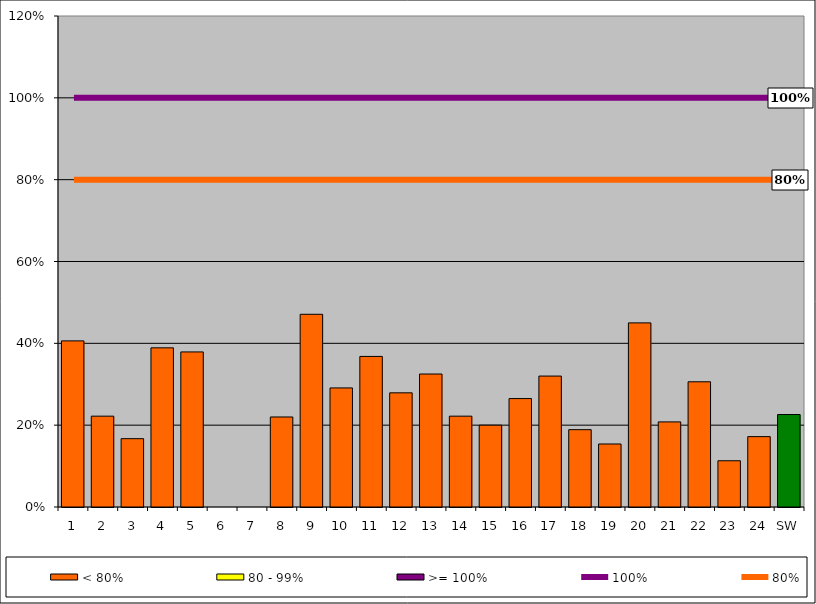
| Category | < 80% | 80 - 99% | >= 100% |
|---|---|---|---|
| 1 | 0.406 | 0 | 0 |
| 2 | 0.222 | 0 | 0 |
| 3 | 0.167 | 0 | 0 |
| 4 | 0.389 | 0 | 0 |
| 5 | 0.379 | 0 | 0 |
| 6 | 0 | 0 | 0 |
| 7 | 0 | 0 | 0 |
| 8 | 0.22 | 0 | 0 |
| 9 | 0.471 | 0 | 0 |
| 10 | 0.291 | 0 | 0 |
| 11 | 0.368 | 0 | 0 |
| 12 | 0.279 | 0 | 0 |
| 13 | 0.325 | 0 | 0 |
| 14 | 0.222 | 0 | 0 |
| 15 | 0.2 | 0 | 0 |
| 16 | 0.265 | 0 | 0 |
| 17 | 0.32 | 0 | 0 |
| 18 | 0.189 | 0 | 0 |
| 19 | 0.154 | 0 | 0 |
| 20 | 0.45 | 0 | 0 |
| 21 | 0.208 | 0 | 0 |
| 22 | 0.306 | 0 | 0 |
| 23 | 0.113 | 0 | 0 |
| 24 | 0.172 | 0 | 0 |
| SW | 0.226 | 0 | 0 |